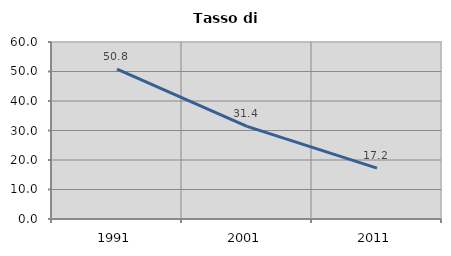
| Category | Tasso di disoccupazione   |
|---|---|
| 1991.0 | 50.763 |
| 2001.0 | 31.389 |
| 2011.0 | 17.231 |